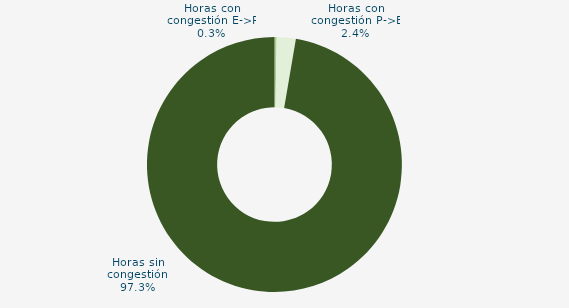
| Category | Horas con congestión E->P |
|---|---|
| Horas con congestión E->P | 0.269 |
| Horas con congestión P->E | 2.419 |
| Horas sin congestión | 97.312 |